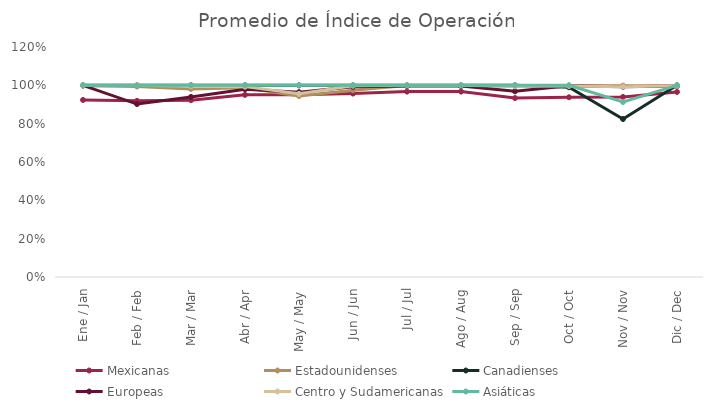
| Category | Mexicanas | Estadounidenses | Canadienses | Europeas | Centro y Sudamericanas | Asiáticas |
|---|---|---|---|---|---|---|
| Ene / Jan | 0.924 | 0.998 | 1 | 1 | 1 | 1 |
| Feb / Feb | 0.919 | 0.994 | 1 | 0.902 | 1 | 1 |
| Mar / Mar | 0.923 | 0.981 | 1 | 0.939 | 0.995 | 1 |
| Abr / Apr | 0.95 | 0.987 | 1 | 0.98 | 0.993 | 1 |
| May / May | 0.951 | 0.944 | 1 | 0.964 | 0.956 | 1 |
| Jun / Jun | 0.957 | 0.975 | 1 | 0.992 | 0.998 | 1 |
| Jul / Jul | 0.967 | 0.999 | 1 | 0.996 | 1 | 1 |
| Ago / Aug | 0.967 | 1 | 1 | 0.996 | 1 | 1 |
| Sep / Sep | 0.934 | 0.996 | 1 | 0.969 | 0.995 | 1 |
| Oct / Oct | 0.938 | 0.998 | 0.99 | 0.998 | 0.996 | 1 |
| Nov / Nov | 0.939 | 0.998 | 0.824 | 0.992 | 0.993 | 0.913 |
| Dic / Dec | 0.965 | 0.998 | 1 | 0.996 | 0.998 | 1 |